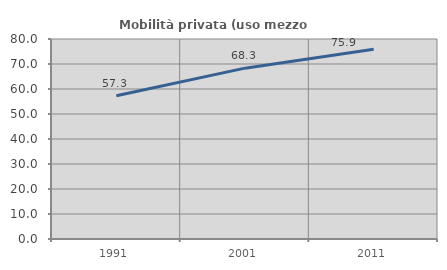
| Category | Mobilità privata (uso mezzo privato) |
|---|---|
| 1991.0 | 57.281 |
| 2001.0 | 68.34 |
| 2011.0 | 75.891 |